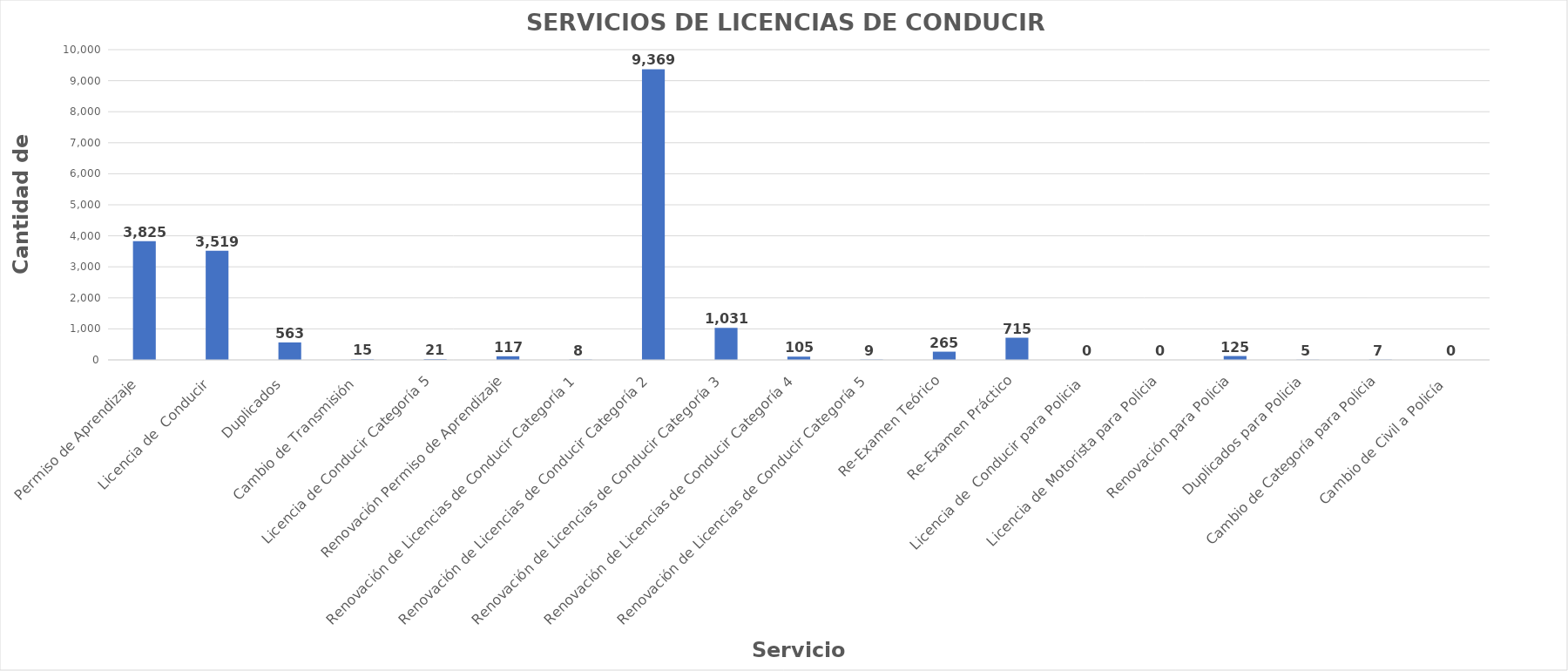
| Category | Series 0 |
|---|---|
| Permiso de Aprendizaje  | 3825 |
| Licencia de  Conducir  | 3519 |
| Duplicados  | 563 |
| Cambio de Transmisión  | 15 |
| Licencia de Conducir Categoría 5 | 21 |
| Renovación Permiso de Aprendizaje | 117 |
| Renovación de Licencias de Conducir Categoría 1 | 8 |
| Renovación de Licencias de Conducir Categoría 2 | 9369 |
| Renovación de Licencias de Conducir Categoría 3 | 1031 |
| Renovación de Licencias de Conducir Categoría 4 | 105 |
| Renovación de Licencias de Conducir Categoría 5 | 9 |
| Re-Examen Teórico | 265 |
| Re-Examen Práctico | 715 |
| Licencia de  Conducir para Policia  | 0 |
| Licencia de Motorista para Policia | 0 |
| Renovación para Policia | 125 |
| Duplicados para Policia | 5 |
| Cambio de Categoría para Policia | 7 |
| Cambio de Civil a Policía  | 0 |